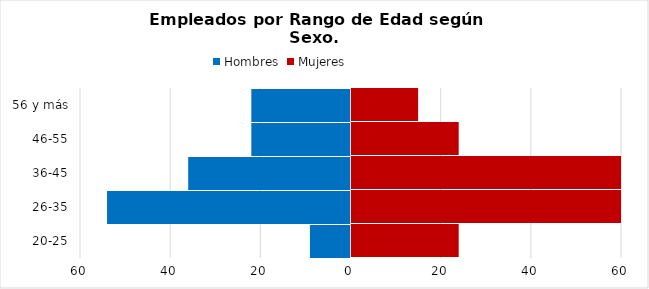
| Category | Hombres | Mujeres |
|---|---|---|
| 20-25 | -9 | 24 |
| 26-35 | -54 | 87 |
| 36-45 | -36 | 65 |
| 46-55 | -22 | 24 |
| 56 y más | -22 | 15 |